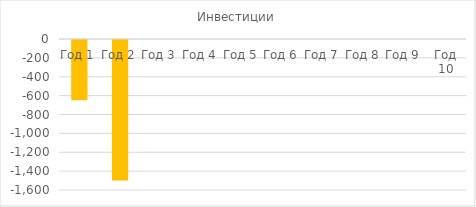
| Category | Инвестиции |
|---|---|
| Год 1 | -637.5 |
| Год 2 | -1487.5 |
| Год 3 | 0 |
| Год 4 | 0 |
| Год 5 | 0 |
| Год 6 | 0 |
| Год 7 | 0 |
| Год 8 | 0 |
| Год 9 | 0 |
| Год 10 | 0 |